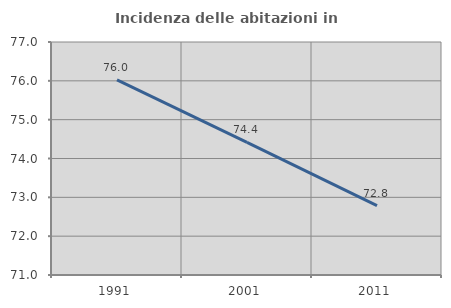
| Category | Incidenza delle abitazioni in proprietà  |
|---|---|
| 1991.0 | 76.022 |
| 2001.0 | 74.415 |
| 2011.0 | 72.788 |